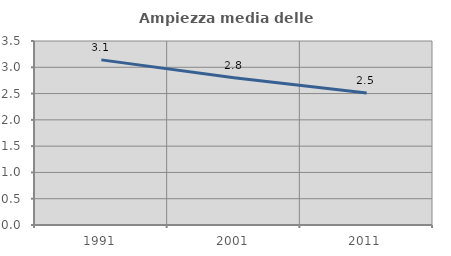
| Category | Ampiezza media delle famiglie |
|---|---|
| 1991.0 | 3.141 |
| 2001.0 | 2.801 |
| 2011.0 | 2.509 |